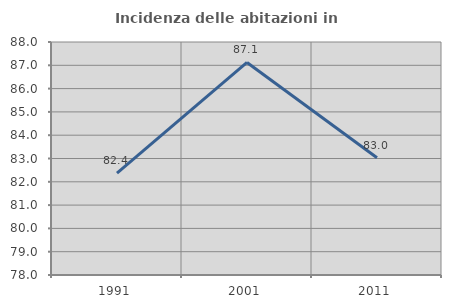
| Category | Incidenza delle abitazioni in proprietà  |
|---|---|
| 1991.0 | 82.373 |
| 2001.0 | 87.121 |
| 2011.0 | 83.034 |